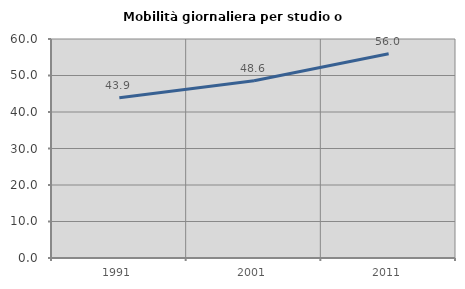
| Category | Mobilità giornaliera per studio o lavoro |
|---|---|
| 1991.0 | 43.876 |
| 2001.0 | 48.588 |
| 2011.0 | 55.977 |